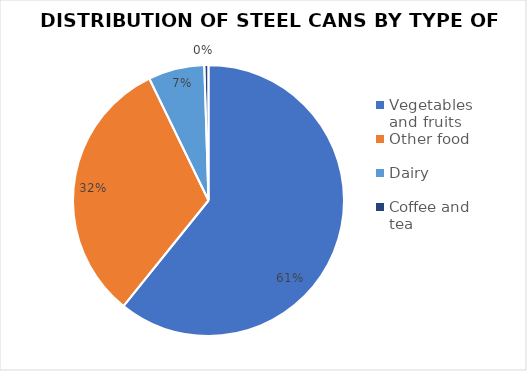
| Category | Series 1 | Series 0 |
|---|---|---|
| Vegetables and fruits | 245 | 245 |
| Other food | 129 | 129 |
| Dairy | 27 | 27 |
| Coffee and tea | 2 | 2 |